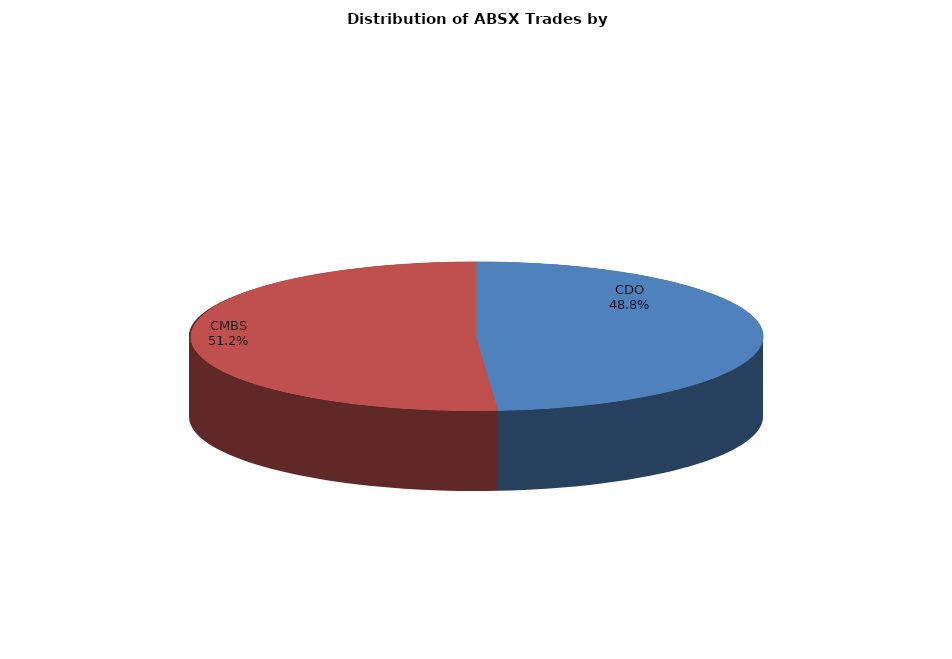
| Category | Series 0 |
|---|---|
| CDO | 224.602 |
| CMBS | 235.801 |